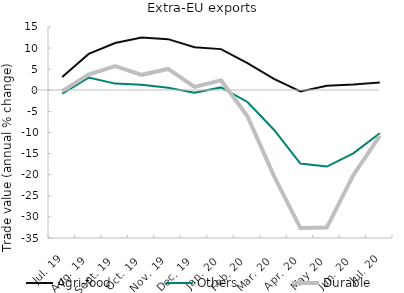
| Category | Agri-food | Others | Durable |
|---|---|---|---|
| Jul. 19 | 3.127 | -0.782 | -0.205 |
| Aug. 19 | 8.617 | 3.006 | 3.723 |
| Sept. 19 | 11.194 | 1.585 | 5.72 |
| Oct. 19 | 12.524 | 1.323 | 3.668 |
| Nov. 19 | 12.125 | 0.605 | 5.065 |
| Dec. 19 | 10.186 | -0.547 | 0.804 |
| Jan. 20 | 9.759 | 0.682 | 2.379 |
| Feb. 20 | 6.444 | -2.76 | -6.16 |
| Mar. 20 | 2.727 | -9.333 | -20.259 |
| Apr. 20 | -0.279 | -17.368 | -32.643 |
| May 20 | 1.084 | -18.064 | -32.494 |
| Jun. 20 | 1.349 | -14.953 | -20.114 |
| Jul. 20 | 1.859 | -10.167 | -10.802 |